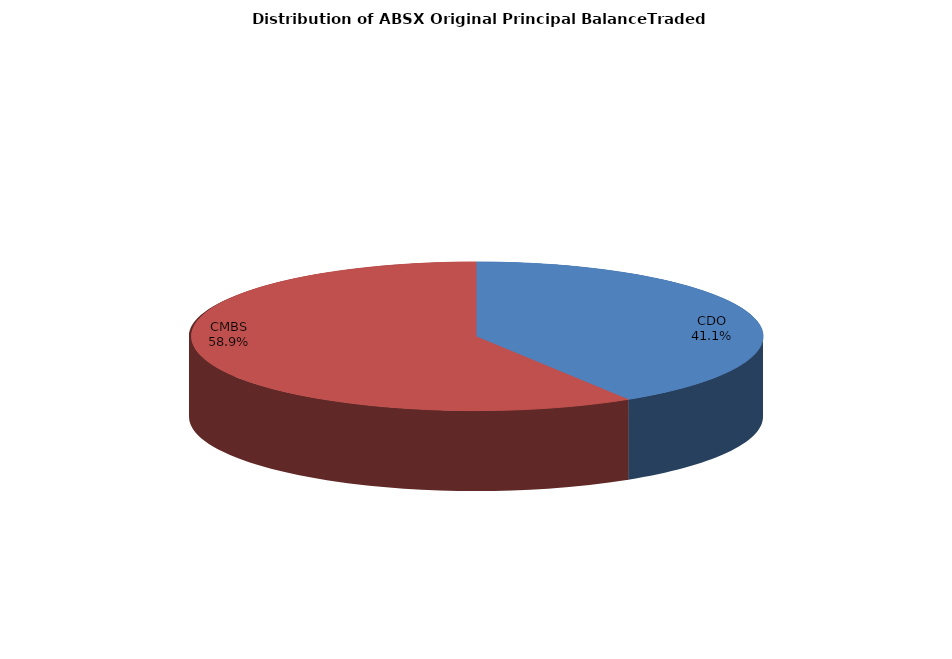
| Category | Series 0 |
|---|---|
| CDO | 1083767216.704 |
| CMBS | 1553046727.295 |